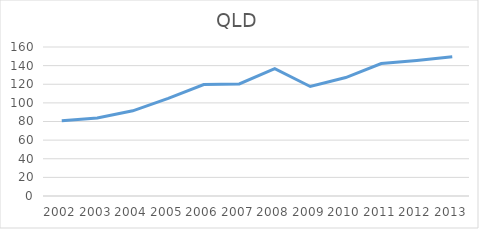
| Category | QLD |
|---|---|
| 2002 | 80.876 |
| 2003 | 83.796 |
| 2004 | 91.476 |
| 2005 | 104.867 |
| 2006 | 119.659 |
| 2007 | 120.272 |
| 2008 | 136.7 |
| 2009 | 117.618 |
| 2010 | 127.207 |
| 2011 | 142.212 |
| 2012 | 145.6 |
| 2013 | 149.593 |